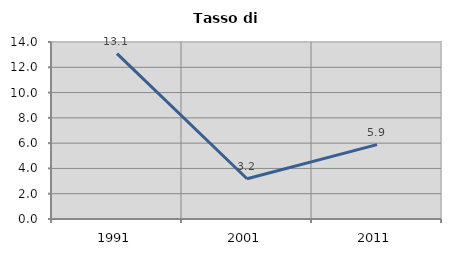
| Category | Tasso di disoccupazione   |
|---|---|
| 1991.0 | 13.074 |
| 2001.0 | 3.185 |
| 2011.0 | 5.882 |